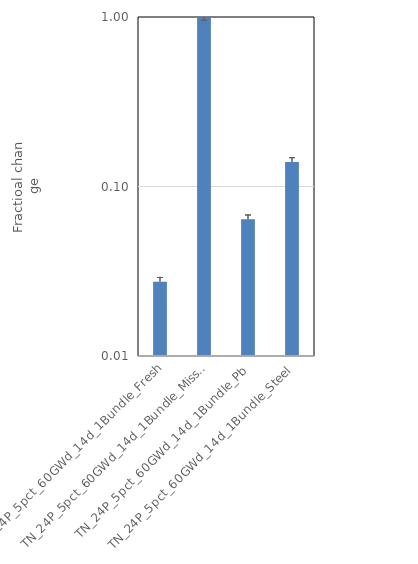
| Category | Series 0 |
|---|---|
| TN_24P_5pct_60GWd_14d_1Bundle_Fresh | 0.027 |
| TN_24P_5pct_60GWd_14d_1Bundle_Missing | 1.013 |
| TN_24P_5pct_60GWd_14d_1Bundle_Pb | 0.064 |
| TN_24P_5pct_60GWd_14d_1Bundle_Steel | 0.14 |